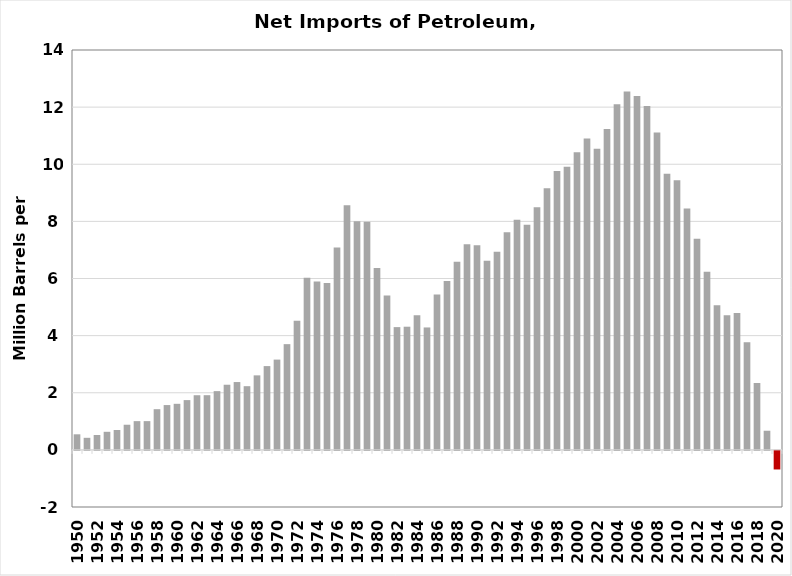
| Category | Series 0 |
|---|---|
| 1950.0 | 0.545 |
| 1951.0 | 0.422 |
| 1952.0 | 0.52 |
| 1953.0 | 0.633 |
| 1954.0 | 0.696 |
| 1955.0 | 0.88 |
| 1956.0 | 1.006 |
| 1957.0 | 1.007 |
| 1958.0 | 1.425 |
| 1959.0 | 1.569 |
| 1960.0 | 1.613 |
| 1961.0 | 1.743 |
| 1962.0 | 1.913 |
| 1963.0 | 1.915 |
| 1964.0 | 2.057 |
| 1965.0 | 2.281 |
| 1966.0 | 2.375 |
| 1967.0 | 2.23 |
| 1968.0 | 2.609 |
| 1969.0 | 2.933 |
| 1970.0 | 3.161 |
| 1971.0 | 3.701 |
| 1972.0 | 4.519 |
| 1973.0 | 6.025 |
| 1974.0 | 5.892 |
| 1975.0 | 5.846 |
| 1976.0 | 7.09 |
| 1977.0 | 8.565 |
| 1978.0 | 8.002 |
| 1979.0 | 7.985 |
| 1980.0 | 6.365 |
| 1981.0 | 5.401 |
| 1982.0 | 4.298 |
| 1983.0 | 4.312 |
| 1984.0 | 4.715 |
| 1985.0 | 4.286 |
| 1986.0 | 5.439 |
| 1987.0 | 5.914 |
| 1988.0 | 6.587 |
| 1989.0 | 7.202 |
| 1990.0 | 7.161 |
| 1991.0 | 6.626 |
| 1992.0 | 6.938 |
| 1993.0 | 7.618 |
| 1994.0 | 8.054 |
| 1995.0 | 7.886 |
| 1996.0 | 8.498 |
| 1997.0 | 9.158 |
| 1998.0 | 9.764 |
| 1999.0 | 9.912 |
| 2000.0 | 10.419 |
| 2001.0 | 10.9 |
| 2002.0 | 10.546 |
| 2003.0 | 11.238 |
| 2004.0 | 12.097 |
| 2005.0 | 12.549 |
| 2006.0 | 12.39 |
| 2007.0 | 12.036 |
| 2008.0 | 11.114 |
| 2009.0 | 9.667 |
| 2010.0 | 9.441 |
| 2011.0 | 8.45 |
| 2012.0 | 7.393 |
| 2013.0 | 6.237 |
| 2014.0 | 5.065 |
| 2015.0 | 4.711 |
| 2016.0 | 4.795 |
| 2017.0 | 3.768 |
| 2018.0 | 2.341 |
| 2019.0 | 0.67 |
| 2020.0 | -0.651 |